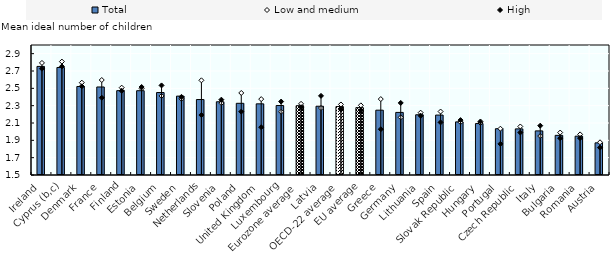
| Category | Total |
|---|---|
| Ireland | 2.753 |
| Cyprus (b,c) | 2.741 |
| Denmark | 2.521 |
| France | 2.516 |
| Finland | 2.473 |
| Estonia | 2.473 |
| Belgium | 2.452 |
| Sweden | 2.41 |
| Netherlands | 2.371 |
| Slovenia | 2.345 |
| Poland | 2.327 |
| United Kingdom | 2.321 |
| Luxembourg | 2.302 |
| Eurozone average | 2.3 |
| Latvia | 2.294 |
| OECD-22 average | 2.29 |
| EU average | 2.277 |
| Greece | 2.248 |
| Germany | 2.222 |
| Lithuania | 2.195 |
| Spain | 2.191 |
| Slovak Republic | 2.113 |
| Hungary | 2.094 |
| Portugal | 2.034 |
| Czech Republic | 2.032 |
| Italy | 2.009 |
| Bulgaria | 1.958 |
| Romania | 1.948 |
| Austria | 1.871 |